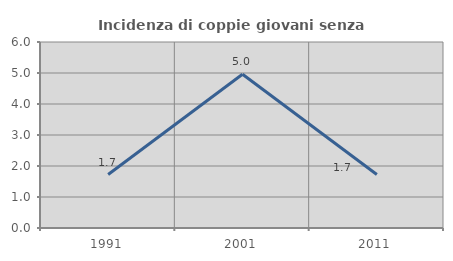
| Category | Incidenza di coppie giovani senza figli |
|---|---|
| 1991.0 | 1.724 |
| 2001.0 | 4.959 |
| 2011.0 | 1.724 |